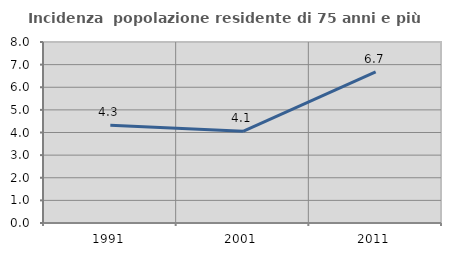
| Category | Incidenza  popolazione residente di 75 anni e più |
|---|---|
| 1991.0 | 4.321 |
| 2001.0 | 4.051 |
| 2011.0 | 6.679 |